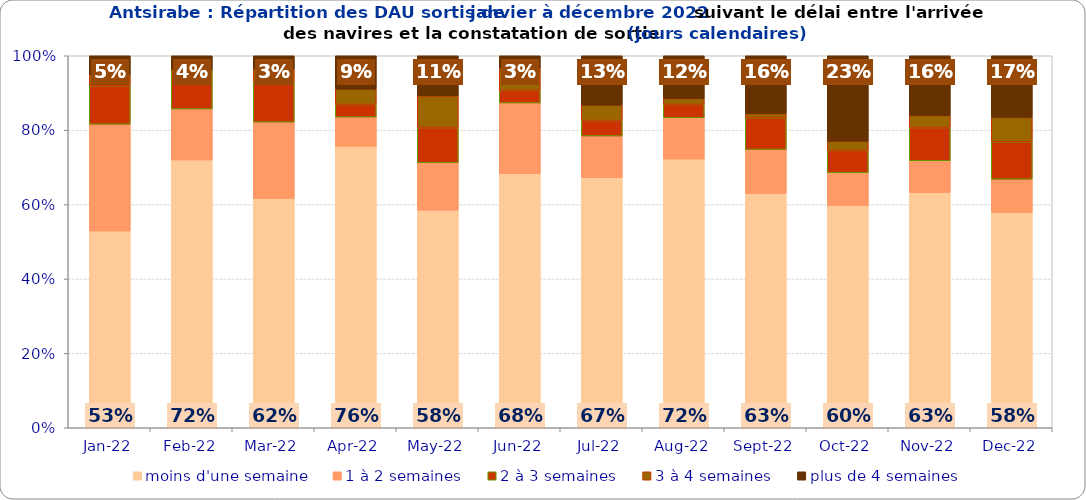
| Category | moins d'une semaine | 1 à 2 semaines | 2 à 3 semaines | 3 à 4 semaines | plus de 4 semaines |
|---|---|---|---|---|---|
| 2022-01-01 | 0.529 | 0.287 | 0.103 | 0.029 | 0.052 |
| 2022-02-01 | 0.72 | 0.137 | 0.104 | 0 | 0.038 |
| 2022-03-01 | 0.616 | 0.205 | 0.109 | 0.035 | 0.035 |
| 2022-04-01 | 0.757 | 0.079 | 0.034 | 0.041 | 0.09 |
| 2022-05-01 | 0.585 | 0.127 | 0.095 | 0.085 | 0.108 |
| 2022-06-01 | 0.683 | 0.19 | 0.034 | 0.06 | 0.034 |
| 2022-07-01 | 0.672 | 0.112 | 0.041 | 0.041 | 0.133 |
| 2022-08-01 | 0.722 | 0.111 | 0.036 | 0.016 | 0.115 |
| 2022-09-01 | 0.63 | 0.119 | 0.085 | 0.011 | 0.156 |
| 2022-10-01 | 0.597 | 0.088 | 0.06 | 0.025 | 0.23 |
| 2022-11-01 | 0.632 | 0.086 | 0.089 | 0.032 | 0.161 |
| 2022-12-01 | 0.578 | 0.09 | 0.101 | 0.065 | 0.166 |